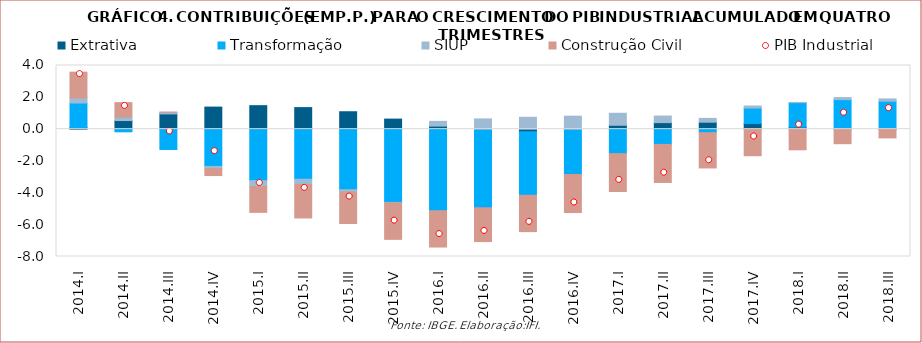
| Category | Extrativa | Transformação | SIUP | Construção Civil |
|---|---|---|---|---|
| 2014.I | 0.092 | 1.551 | 0.319 | 1.618 |
| 2014.II | 0.541 | -0.166 | 0.216 | 0.91 |
| 2014.III | 0.96 | -1.275 | 0.097 | 0.016 |
| 2014.IV | 1.386 | -2.341 | -0.135 | -0.439 |
| 2015.I | 1.477 | -3.232 | -0.371 | -1.624 |
| 2015.II | 1.353 | -3.146 | -0.329 | -2.104 |
| 2015.III | 1.095 | -3.806 | -0.134 | -1.986 |
| 2015.IV | 0.632 | -4.601 | -0.026 | -2.297 |
| 2016.I | 0.191 | -5.123 | 0.298 | -2.282 |
| 2016.II | -0.037 | -4.903 | 0.645 | -2.122 |
| 2016.III | -0.161 | -3.994 | 0.746 | -2.282 |
| 2016.IV | -0.028 | -2.818 | 0.816 | -2.393 |
| 2017.I | 0.245 | -1.537 | 0.753 | -2.379 |
| 2017.II | 0.411 | -0.958 | 0.413 | -2.391 |
| 2017.III | 0.438 | -0.218 | 0.239 | -2.218 |
| 2017.IV | 0.355 | 0.973 | 0.125 | -1.669 |
| 2018.I | 0.124 | 1.54 | 0.012 | -1.297 |
| 2018.II | 0.014 | 1.842 | 0.13 | -0.913 |
| 2018.III | 0.009 | 1.746 | 0.147 | -0.547 |